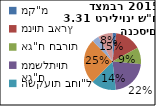
| Category | Series 0 |
|---|---|
| מק"מ | 0.022 |
| מניות בארץ | 0.149 |
| אג"ח חברות | 0.095 |
| אג"ח ממשלתיות | 0.216 |
| השקעות בחו"ל | 0.142 |
| פיקדונות | 0.255 |
| נכסים אחרים* | 0.039 |
| מזומן ועו"ש | 0.083 |